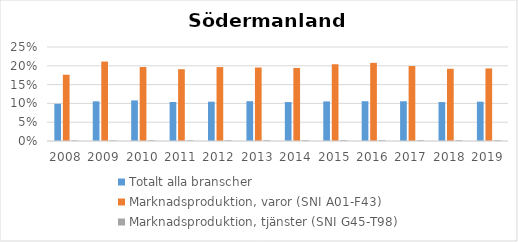
| Category | Totalt alla branscher | Marknadsproduktion, varor (SNI A01-F43) | Marknadsproduktion, tjänster (SNI G45-T98) |
|---|---|---|---|
| 2008 | 0.099 | 0.176 | 0.002 |
| 2009 | 0.106 | 0.211 | 0.002 |
| 2010 | 0.108 | 0.197 | 0.002 |
| 2011 | 0.104 | 0.191 | 0.002 |
| 2012 | 0.105 | 0.197 | 0.002 |
| 2013 | 0.106 | 0.195 | 0.002 |
| 2014 | 0.104 | 0.194 | 0.002 |
| 2015 | 0.105 | 0.204 | 0.002 |
| 2016 | 0.106 | 0.208 | 0.002 |
| 2017 | 0.106 | 0.199 | 0.002 |
| 2018 | 0.104 | 0.192 | 0.002 |
| 2019 | 0.105 | 0.193 | 0.002 |